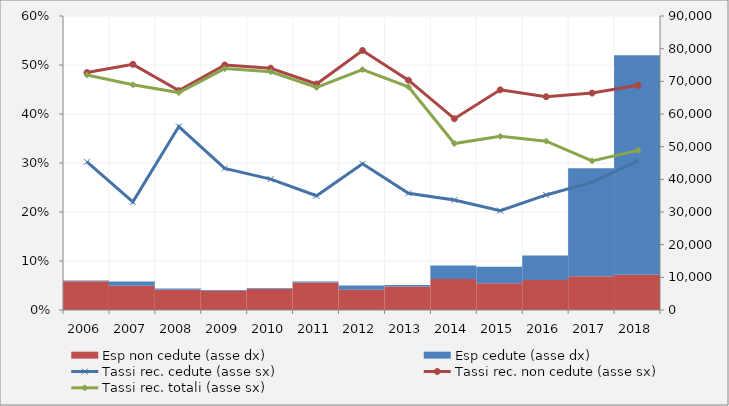
| Category | Esp non cedute (asse dx)  | Esp cedute (asse dx) |
|---|---|---|
| 2006.0 | 8803040402 | 236068123 |
| 2007.0 | 7442770518 | 1298764521 |
| 2008.0 | 6225493473 | 354965552 |
| 2009.0 | 5892617853 | 216283928 |
| 2010.0 | 6454267206 | 212601734 |
| 2011.0 | 8441794414 | 276187901 |
| 2012.0 | 6206683948 | 1265786059 |
| 2013.0 | 7228959124 | 454084164 |
| 2014.0 | 9462846090 | 4149678117 |
| 2015.0 | 8157372643 | 5100781018 |
| 2016.0 | 9154968848 | 7557258123 |
| 2017.0 | 10348998626 | 33010733708 |
| 2018.0 | 10794203636 | 67222799218 |